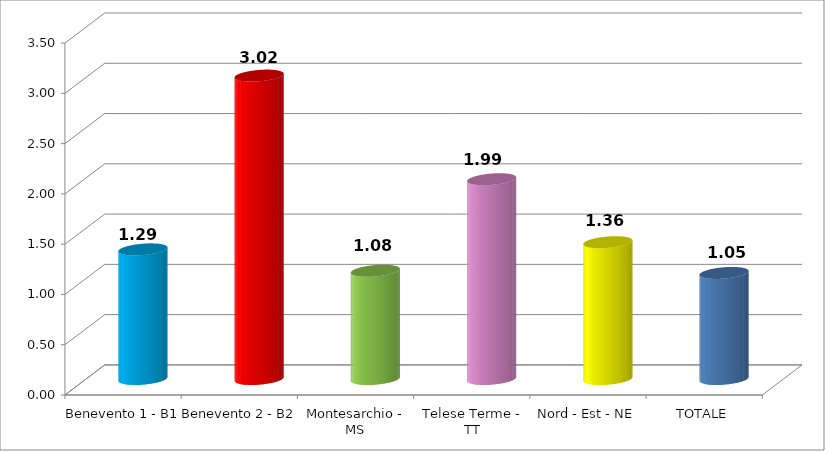
| Category | Series 0 |
|---|---|
| Benevento 1 - B1 | 1.289 |
| Benevento 2 - B2 | 3.017 |
| Montesarchio - MS | 1.077 |
| Telese Terme - TT | 1.987 |
| Nord - Est - NE | 1.36 |
| TOTALE | 1.055 |